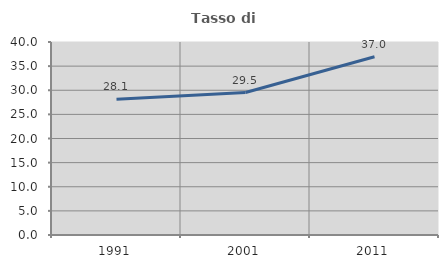
| Category | Tasso di occupazione   |
|---|---|
| 1991.0 | 28.138 |
| 2001.0 | 29.532 |
| 2011.0 | 36.954 |